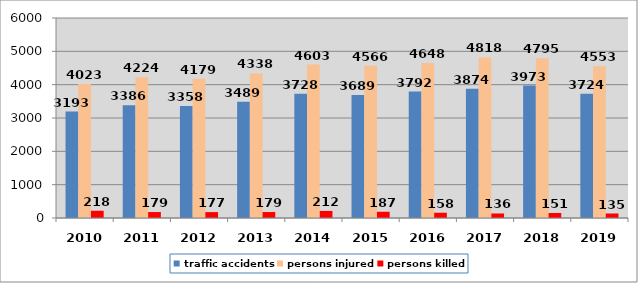
| Category | traffic accidents | persons injured | persons killed |
|---|---|---|---|
| 2010.0 | 3193 | 4023 | 218 |
| 2011.0 | 3386 | 4224 | 179 |
| 2012.0 | 3358 | 4179 | 177 |
| 2013.0 | 3489 | 4338 | 179 |
| 2014.0 | 3728 | 4603 | 212 |
| 2015.0 | 3689 | 4566 | 187 |
| 2016.0 | 3792 | 4648 | 158 |
| 2017.0 | 3874 | 4818 | 136 |
| 2018.0 | 3973 | 4795 | 151 |
| 2019.0 | 3724 | 4553 | 135 |